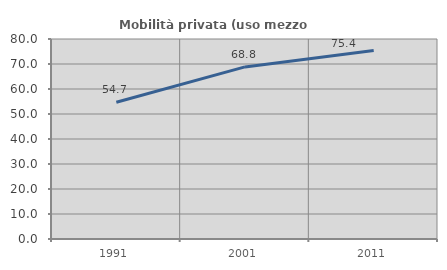
| Category | Mobilità privata (uso mezzo privato) |
|---|---|
| 1991.0 | 54.699 |
| 2001.0 | 68.844 |
| 2011.0 | 75.431 |